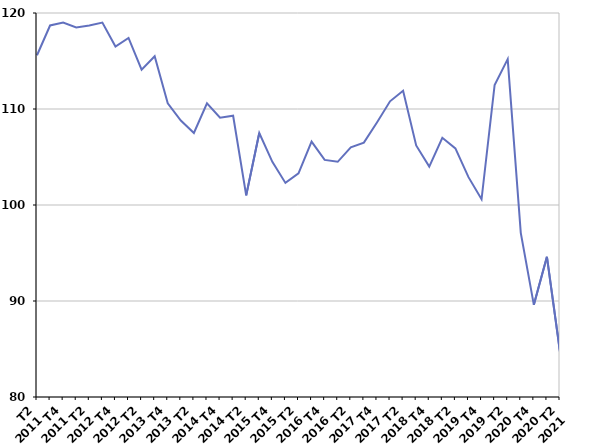
| Category | Fin de contrat |
|---|---|
| T2
2011 | 115.6 |
| T3
2011 | 118.7 |
| T4
2011 | 119 |
| T1
2012 | 118.5 |
| T2
2012 | 118.7 |
| T3
2012 | 119 |
| T4
2012 | 116.5 |
| T1
2013 | 117.4 |
| T2
2013 | 114.1 |
| T3
2013 | 115.5 |
| T4
2013 | 110.6 |
| T1
2014 | 108.8 |
| T2
2014 | 107.5 |
| T3
2014 | 110.6 |
| T4
2014 | 109.1 |
| T1
2015 | 109.3 |
| T2
2015 | 101 |
| T3
2015 | 107.5 |
| T4
2015 | 104.5 |
| T1
2016 | 102.3 |
| T2
2016 | 103.3 |
| T3
2016 | 106.6 |
| T4
2016 | 104.7 |
| T1
2017 | 104.5 |
| T2
2017 | 106 |
| T3
2017 | 106.5 |
| T4
2017 | 108.6 |
| T1
2018 | 110.8 |
| T2
2018 | 111.9 |
| T3
2018 | 106.2 |
| T4
2018 | 104 |
| T1
2019 | 107 |
| T2
2019 | 105.9 |
| T3
2019 | 102.9 |
| T4
2019 | 100.6 |
| T1
2020 | 112.5 |
| T2
2020 | 115.2 |
| T3
2020 | 97.1 |
| T4
2020 | 89.6 |
| T1
2021 | 94.6 |
| T2
2021 | 84.7 |